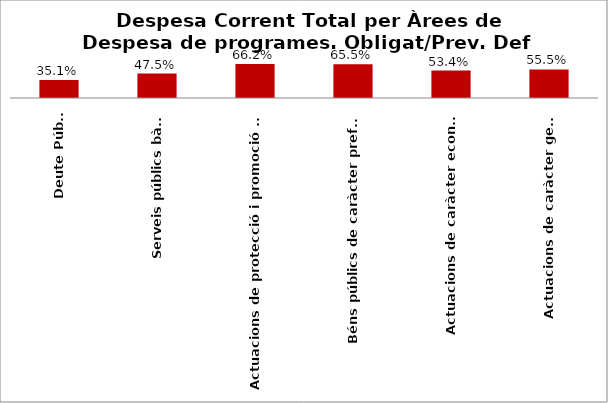
| Category | Series 0 |
|---|---|
| Deute Públic | 0.351 |
| Serveis públics bàsics | 0.475 |
| Actuacions de protecció i promoció social | 0.662 |
| Béns públics de caràcter preferent | 0.655 |
| Actuacions de caràcter econòmic | 0.534 |
| Actuacions de caràcter general | 0.555 |